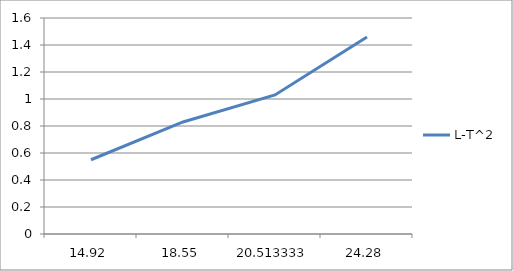
| Category | L-T^2 |
|---|---|
| 14.92 | 0.55 |
| 18.55 | 0.83 |
| 20.513333 | 1.03 |
| 24.28 | 1.46 |